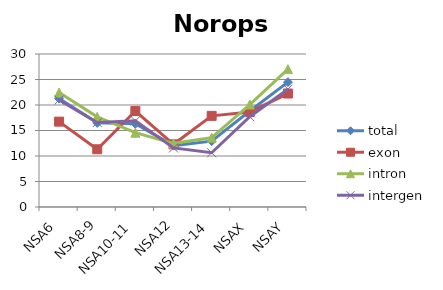
| Category | total  | exon | intron | intergen |
|---|---|---|---|---|
| NSA6 | 21.26 | 16.74 | 22.43 | 20.97 |
| NSA8-9 | 16.5 | 11.32 | 17.68 | 16.55 |
| NSA10-11 | 16.32 | 18.82 | 14.57 | 16.89 |
| NSA12 | 12.04 | 12.29 | 12.48 | 11.59 |
| NSA13-14 | 12.91 | 17.87 | 13.59 | 10.64 |
| NSAX | 18.83 | 18.64 | 20.09 | 17.7 |
| NSAY | 24.48 | 22.25 | 27.04 | 23.11 |